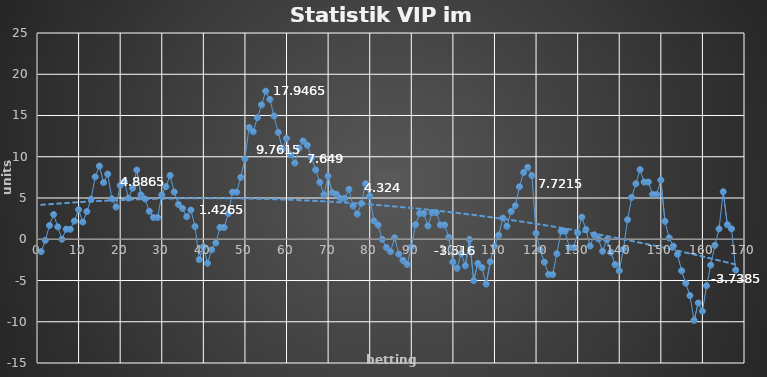
| Category | Series 0 |
|---|---|
| 0 | -1.5 |
| 1 | -0.135 |
| 2 | 1.665 |
| 3 | 3 |
| 4 | 1.5 |
| 5 | 0 |
| 6 | 1.215 |
| 7 | 1.215 |
| 8 | 2.205 |
| 9 | 3.585 |
| 10 | 2.085 |
| 11 | 3.36 |
| 12 | 4.86 |
| 13 | 7.56 |
| 14 | 8.865 |
| 15 | 6.865 |
| 16 | 7.905 |
| 17 | 4.905 |
| 18 | 3.905 |
| 19 | 6.515 |
| 20 | 6.986 |
| 21 | 4.986 |
| 22 | 6.187 |
| 23 | 8.387 |
| 24 | 5.387 |
| 25 | 4.887 |
| 26 | 3.387 |
| 27 | 2.637 |
| 28 | 2.637 |
| 29 | 5.377 |
| 30 | 6.377 |
| 31 | 7.727 |
| 32 | 5.727 |
| 33 | 4.227 |
| 34 | 3.727 |
| 35 | 2.727 |
| 36 | 3.537 |
| 37 | 1.537 |
| 38 | -2.463 |
| 39 | -0.913 |
| 40 | -2.913 |
| 41 | -1.278 |
| 42 | -0.453 |
| 43 | 1.427 |
| 44 | 1.427 |
| 45 | 3.122 |
| 46 | 5.702 |
| 47 | 5.702 |
| 48 | 7.502 |
| 49 | 9.762 |
| 50 | 13.542 |
| 51 | 13.042 |
| 52 | 14.737 |
| 53 | 16.297 |
| 54 | 17.946 |
| 55 | 16.946 |
| 56 | 14.946 |
| 57 | 12.946 |
| 58 | 10.946 |
| 59 | 12.236 |
| 60 | 10.236 |
| 61 | 9.236 |
| 62 | 11.036 |
| 63 | 11.899 |
| 64 | 11.399 |
| 65 | 9.899 |
| 66 | 8.399 |
| 67 | 6.899 |
| 68 | 5.399 |
| 69 | 7.649 |
| 70 | 5.649 |
| 71 | 5.449 |
| 72 | 4.949 |
| 73 | 4.949 |
| 74 | 6.049 |
| 75 | 4.049 |
| 76 | 3.049 |
| 77 | 4.324 |
| 78 | 6.724 |
| 79 | 5.224 |
| 80 | 2.224 |
| 81 | 1.724 |
| 82 | -0.006 |
| 83 | -1.006 |
| 84 | -1.506 |
| 85 | 0.194 |
| 86 | -1.806 |
| 87 | -2.556 |
| 88 | -3.056 |
| 89 | -0.936 |
| 90 | 1.764 |
| 91 | 3.114 |
| 92 | 3.114 |
| 93 | 1.614 |
| 94 | 3.234 |
| 95 | 3.234 |
| 96 | 1.734 |
| 97 | 1.734 |
| 98 | 0.234 |
| 99 | -2.766 |
| 100 | -3.516 |
| 101 | -1.716 |
| 102 | -3.216 |
| 103 | -0.016 |
| 104 | -5.016 |
| 105 | -2.936 |
| 106 | -3.436 |
| 107 | -5.436 |
| 108 | -2.736 |
| 109 | -0.861 |
| 110 | 0.489 |
| 111 | 2.569 |
| 112 | 1.569 |
| 113 | 3.369 |
| 114 | 4.059 |
| 115 | 6.359 |
| 116 | 8.084 |
| 117 | 8.721 |
| 118 | 7.721 |
| 119 | 0.721 |
| 120 | -1.279 |
| 121 | -2.779 |
| 122 | -4.279 |
| 123 | -4.279 |
| 124 | -1.759 |
| 125 | 0.971 |
| 126 | 0.971 |
| 127 | -1.029 |
| 128 | -1.029 |
| 129 | 0.771 |
| 130 | 2.671 |
| 131 | 1.171 |
| 132 | -0.829 |
| 133 | 0.536 |
| 134 | 0.036 |
| 135 | -1.464 |
| 136 | -0.069 |
| 137 | -1.569 |
| 138 | -3.069 |
| 139 | -3.819 |
| 140 | -1.199 |
| 141 | 2.361 |
| 142 | 5.081 |
| 143 | 6.731 |
| 144 | 8.432 |
| 145 | 6.932 |
| 146 | 6.932 |
| 147 | 5.432 |
| 148 | 5.432 |
| 149 | 7.172 |
| 150 | 2.172 |
| 151 | 0.172 |
| 152 | -0.828 |
| 153 | -1.828 |
| 154 | -3.828 |
| 155 | -5.328 |
| 156 | -6.828 |
| 157 | -9.828 |
| 158 | -7.728 |
| 159 | -8.728 |
| 160 | -5.639 |
| 161 | -3.139 |
| 162 | -0.739 |
| 163 | 1.261 |
| 164 | 5.762 |
| 165 | 1.761 |
| 166 | 1.261 |
| 167 | -3.738 |